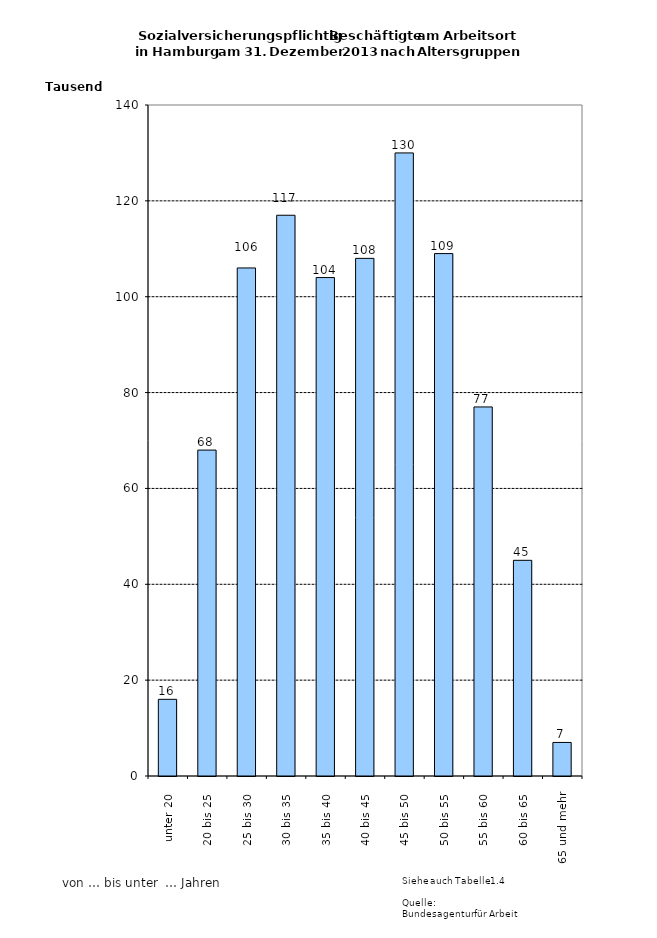
| Category | Series 0 |
|---|---|
| unter 20 | 16000 |
| 20 bis 25 | 68000 |
| 25 bis 30 | 106000 |
| 30 bis 35 | 117000 |
| 35 bis 40 | 104000 |
| 40 bis 45 | 108000 |
| 45 bis 50 | 130000 |
| 50 bis 55 | 109000 |
| 55 bis 60 | 77000 |
| 60 bis 65 | 45000 |
| 65 und mehr | 7000 |